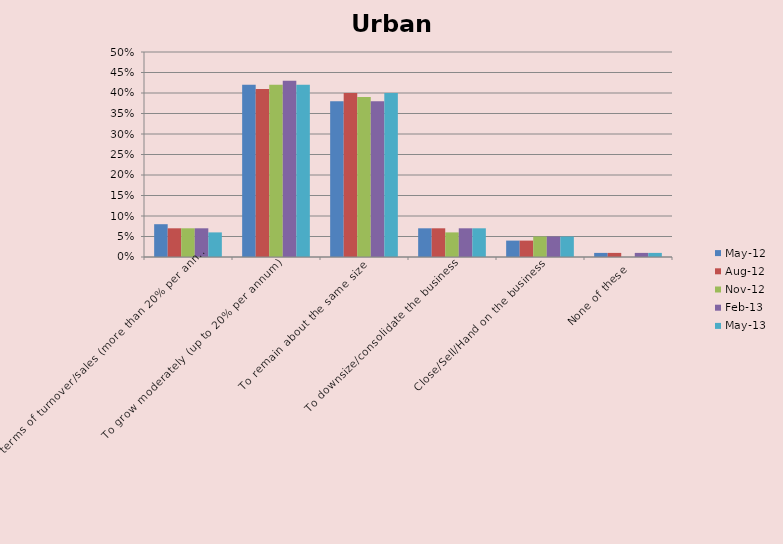
| Category | May-12 | Aug-12 | Nov-12 | Feb-13 | May-13 |
|---|---|---|---|---|---|
| To grow rapidly in terms of turnover/sales (more than 20% per annum) | 0.08 | 0.07 | 0.07 | 0.07 | 0.06 |
| To grow moderately (up to 20% per annum) | 0.42 | 0.41 | 0.42 | 0.43 | 0.42 |
| To remain about the same size | 0.38 | 0.4 | 0.39 | 0.38 | 0.4 |
| To downsize/consolidate the business | 0.07 | 0.07 | 0.06 | 0.07 | 0.07 |
| Close/Sell/Hand on the business | 0.04 | 0.04 | 0.05 | 0.05 | 0.05 |
| None of these | 0.01 | 0.01 | 0 | 0.01 | 0.01 |